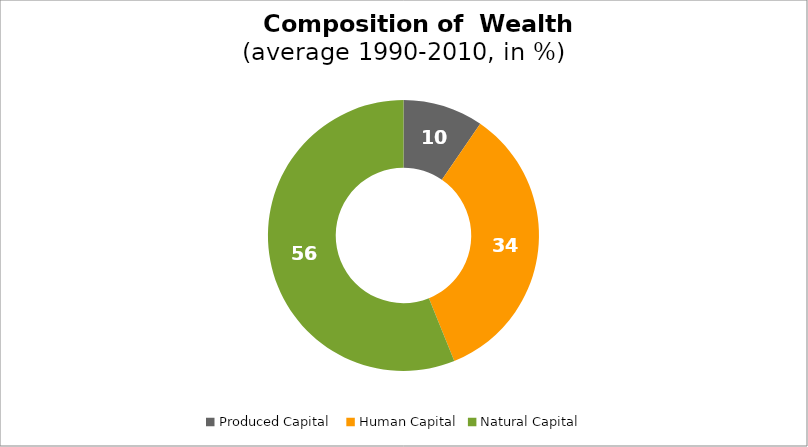
| Category | Series 0 |
|---|---|
| Produced Capital  | 9.582 |
| Human Capital | 34.303 |
| Natural Capital | 56.115 |